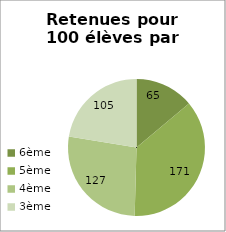
| Category | Series 0 |
|---|---|
| 6ème | 65 |
| 5ème | 171 |
| 4ème | 127 |
| 3ème | 105 |